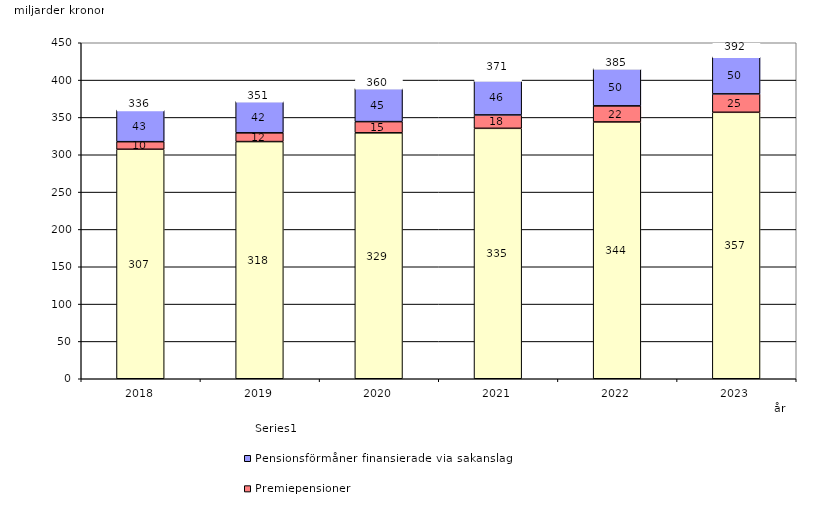
| Category | Inkomstpension och tilläggspension m.m. | Premiepensioner | Pensionsförmåner finansierade via sakanslag | Series 0 |
|---|---|---|---|---|
| 2018.0 | 307.356 | 10.141 | 42.55 | 20 |
| 2019.0 | 317.628 | 11.715 | 42.22 | 20 |
| 2020.0 | 329.365 | 15.016 | 44.546 | 20 |
| 2021.0 | 335.401 | 17.924 | 46.082 | 20 |
| 2022.0 | 343.929 | 21.544 | 49.915 | 20 |
| 2023.0 | 356.858 | 24.658 | 49.628 | 20 |